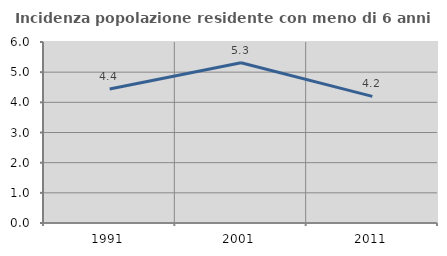
| Category | Incidenza popolazione residente con meno di 6 anni |
|---|---|
| 1991.0 | 4.442 |
| 2001.0 | 5.313 |
| 2011.0 | 4.198 |